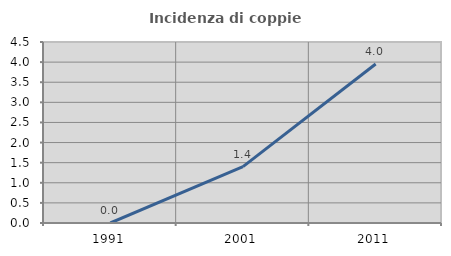
| Category | Incidenza di coppie miste |
|---|---|
| 1991.0 | 0 |
| 2001.0 | 1.402 |
| 2011.0 | 3.953 |